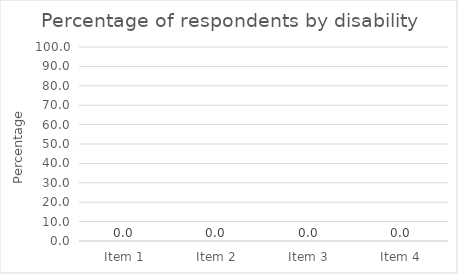
| Category | Series 0 |
|---|---|
| Item 1 | 0 |
| Item 2 | 0 |
| Item 3 | 0 |
| Item 4 | 0 |